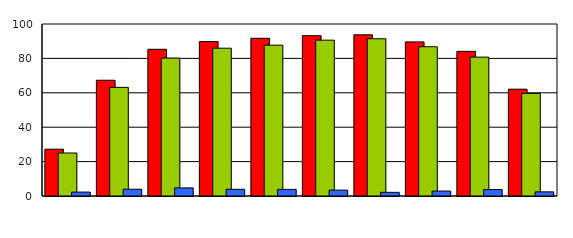
| Category | Series 0 | Series 1 | Series 2 |
|---|---|---|---|
| 0 | 27.2 | 25 | 2.273 |
| 1 | 67.3 | 63.158 | 3.947 |
| 2 | 85.3 | 80.189 | 4.717 |
| 3 | 89.8 | 85.938 | 3.906 |
| 4 | 91.7 | 87.692 | 3.846 |
| 5 | 93.2 | 90.598 | 3.419 |
| 6 | 93.7 | 91.429 | 2.143 |
| 7 | 89.6 | 86.782 | 2.874 |
| 8 | 84.1 | 80.749 | 3.743 |
| 9 | 62.1 | 59.639 | 2.41 |